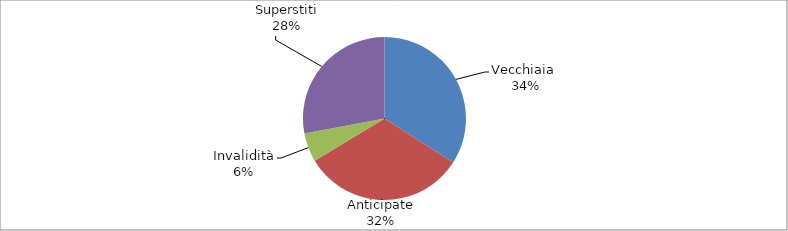
| Category | Series 0 |
|---|---|
| Vecchiaia  | 28007 |
| Anticipate | 26546 |
| Invalidità | 4673 |
| Superstiti | 22995 |